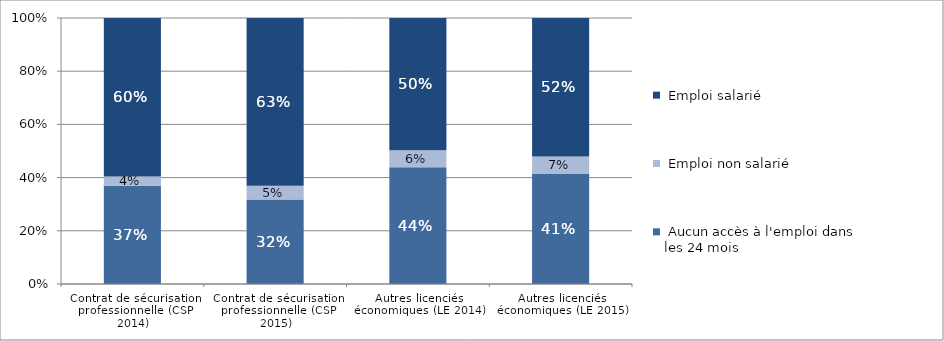
| Category |  Aucun accès à l'emploi dans les 24 mois |  Emploi non salarié  |  Emploi salarié  |
|---|---|---|---|
| Contrat de sécurisation professionnelle (CSP 2014) | 0.369 | 0.035 | 0.595 |
| Contrat de sécurisation professionnelle (CSP 2015) | 0.318 | 0.052 | 0.631 |
| Autres licenciés économiques (LE 2014) | 0.439 | 0.064 | 0.497 |
| Autres licenciés économiques (LE 2015) | 0.414 | 0.065 | 0.521 |